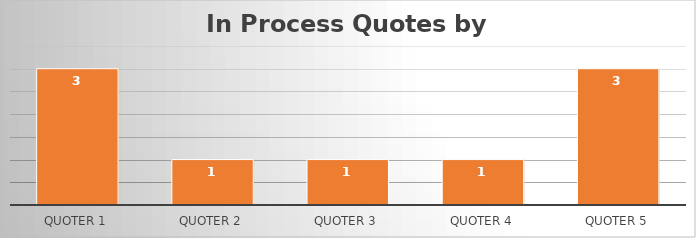
| Category | Series 0 |
|---|---|
| Quoter 1 | 3 |
| Quoter 2 | 1 |
| Quoter 3 | 1 |
| Quoter 4 | 1 |
| Quoter 5 | 3 |